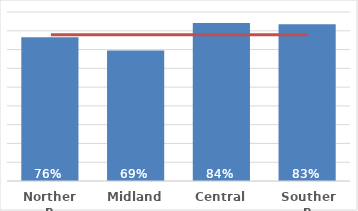
| Category | Total |
|---|---|
| Northern | 0.765 |
| Midland | 0.694 |
| Central | 0.842 |
| Southern | 0.834 |